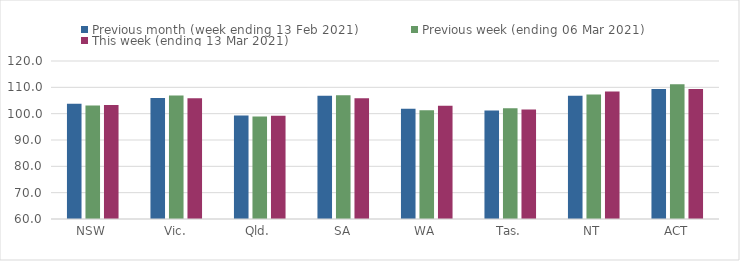
| Category | Previous month (week ending 13 Feb 2021) | Previous week (ending 06 Mar 2021) | This week (ending 13 Mar 2021) |
|---|---|---|---|
| NSW | 103.76 | 103.08 | 103.3 |
| Vic. | 105.91 | 106.86 | 105.83 |
| Qld. | 99.3 | 98.97 | 99.25 |
| SA | 106.8 | 106.96 | 105.83 |
| WA | 101.82 | 101.32 | 103.05 |
| Tas. | 101.21 | 102.03 | 101.62 |
| NT | 106.8 | 107.29 | 108.46 |
| ACT | 109.34 | 111.13 | 109.37 |